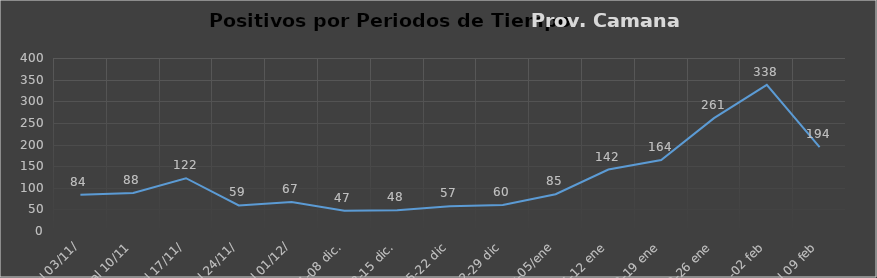
| Category | Prov. Camana  |
|---|---|
| 27/10 al 03/11/ | 84 |
| 03 al 10/11 | 88 |
| 10 al 17/11/ | 122 |
|  17 al 24/11/ | 59 |
|  24/11 al 01/12/ | 67 |
| 01-08 dic. | 47 |
| 08-15 dic. | 48 |
| 15-22 dic | 57 |
| 22-29 dic | 60 |
| 29 dic-05/ene | 85 |
| 05-12 ene | 142 |
| 12-19 ene | 164 |
| 19-26 ene | 261 |
| 26 ene -02 feb | 338 |
| 02 al 09 feb | 194 |